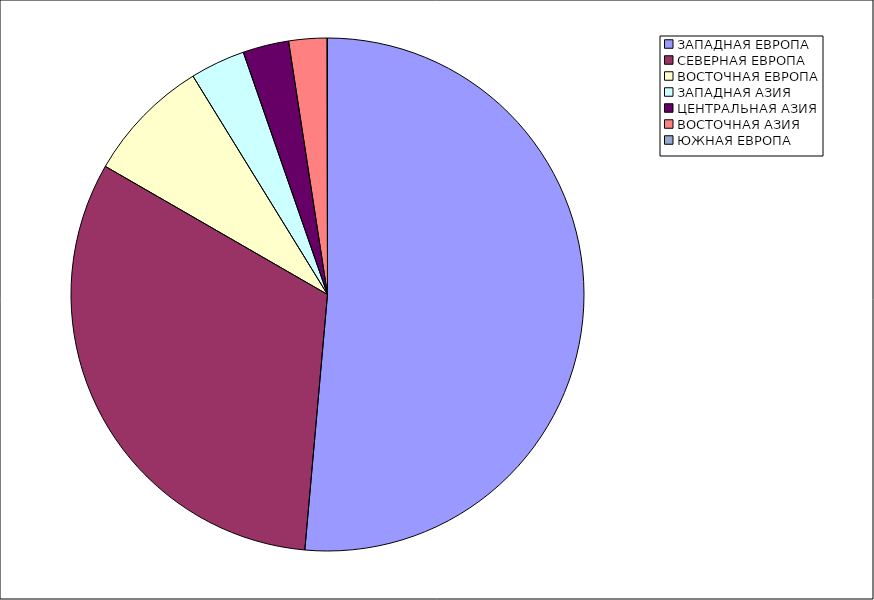
| Category | Оборот |
|---|---|
| ЗАПАДНАЯ ЕВРОПА | 51.41 |
| СЕВЕРНАЯ ЕВРОПА | 31.916 |
| ВОСТОЧНАЯ ЕВРОПА | 7.885 |
| ЗАПАДНАЯ АЗИЯ | 3.463 |
| ЦЕНТРАЛЬНАЯ АЗИЯ | 2.897 |
| ВОСТОЧНАЯ АЗИЯ | 2.404 |
| ЮЖНАЯ ЕВРОПА | 0.024 |